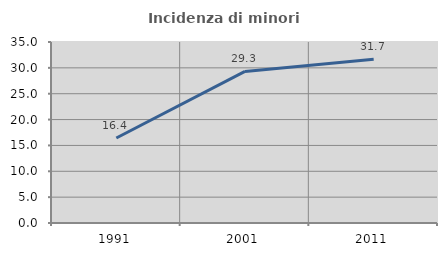
| Category | Incidenza di minori stranieri |
|---|---|
| 1991.0 | 16.438 |
| 2001.0 | 29.314 |
| 2011.0 | 31.67 |